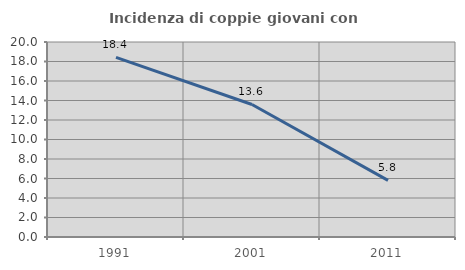
| Category | Incidenza di coppie giovani con figli |
|---|---|
| 1991.0 | 18.421 |
| 2001.0 | 13.594 |
| 2011.0 | 5.803 |